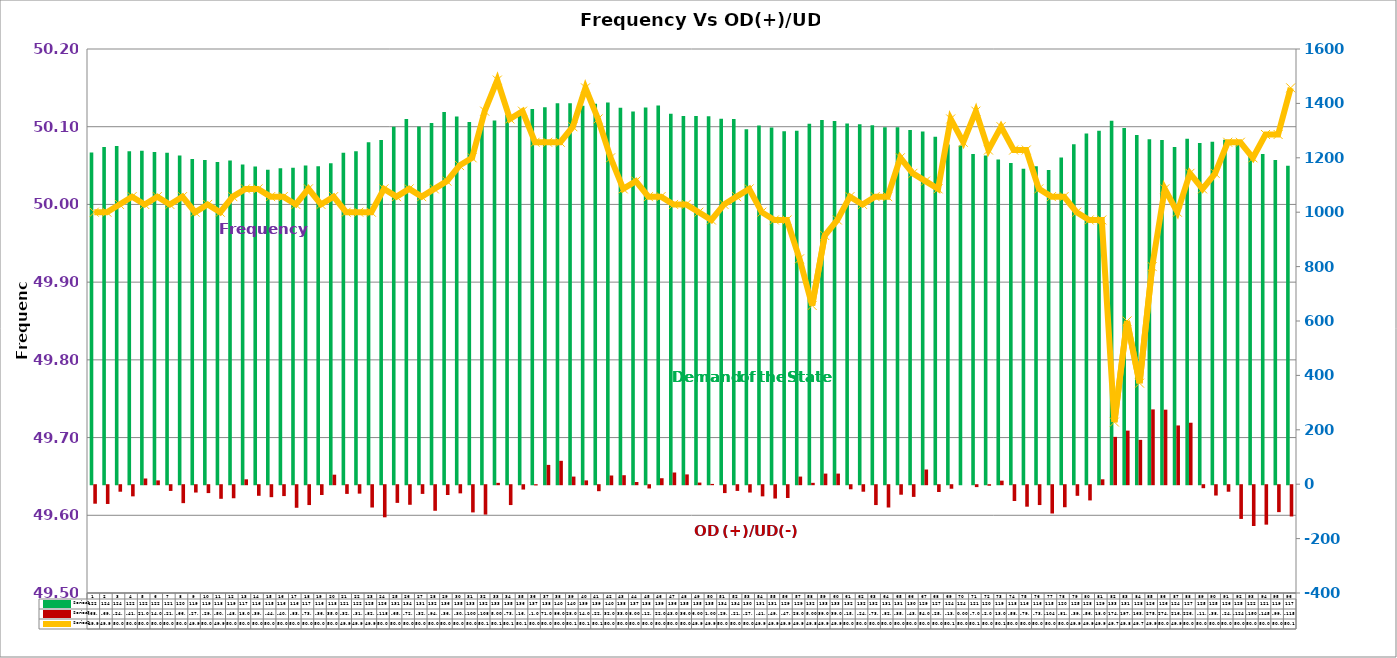
| Category | Series 2 | Series 4 |
|---|---|---|
| 0 | 1219.733 | -68 |
| 1 | 1240 | -69 |
| 2 | 1243 | -24 |
| 3 | 1224 | -41 |
| 4 | 1226 | 21 |
| 5 | 1221 | 14 |
| 6 | 1219 | -21 |
| 7 | 1208 | -66 |
| 8 | 1196 | -27 |
| 9 | 1192 | -29 |
| 10 | 1185 | -50 |
| 11 | 1190 | -48 |
| 12 | 1175 | 18 |
| 13 | 1167.667 | -39 |
| 14 | 1156 | -44 |
| 15 | 1162 | -40 |
| 16 | 1163 | -83 |
| 17 | 1172 | -73 |
| 18 | 1169 | -36 |
| 19 | 1180 | 35 |
| 20 | 1219 | -32 |
| 21 | 1224 | -31 |
| 22 | 1257 | -82 |
| 23 | 1265 | -118 |
| 24 | 1314 | -65 |
| 25 | 1343 | -72 |
| 26 | 1315 | -32 |
| 27 | 1328 | -94 |
| 28 | 1368 | -36 |
| 29 | 1352 | -30 |
| 30 | 1332 | -100 |
| 31 | 1329 | -108 |
| 32 | 1337 | 5 |
| 33 | 1357 | -73 |
| 34 | 1369 | -16 |
| 35 | 1379 | -1 |
| 36 | 1386 | 71 |
| 37 | 1401 | 86 |
| 38 | 1401 | 28 |
| 39 | 1391 | 14 |
| 40 | 1399 | -22 |
| 41 | 1403 | 32 |
| 42 | 1384 | 33 |
| 43 | 1370 | 8 |
| 44 | 1385 | -12 |
| 45 | 1392 | 22 |
| 46 | 1362 | 43 |
| 47 | 1354 | 36 |
| 48 | 1354 | 6 |
| 49 | 1353 | 1 |
| 50 | 1344 | -29 |
| 51 | 1343 | -21 |
| 52 | 1305 | -27 |
| 53 | 1319 | -41 |
| 54 | 1311 | -49 |
| 55 | 1298 | -47 |
| 56 | 1299 | 28 |
| 57 | 1325 | 5 |
| 58 | 1339 | 39 |
| 59 | 1335 | 39 |
| 60 | 1326 | -15 |
| 61 | 1323 | -24 |
| 62 | 1320 | -73 |
| 63 | 1312 | -82 |
| 64 | 1312 | -35 |
| 65 | 1302 | -43 |
| 66 | 1297 | 54 |
| 67 | 1277 | -25 |
| 68 | 1249 | -13 |
| 69 | 1245 | 0 |
| 70 | 1214 | -7 |
| 71 | 1208 | -2 |
| 72 | 1194 | 13 |
| 73 | 1181 | -58 |
| 74 | 1160 | -79 |
| 75 | 1169 | -73 |
| 76 | 1155 | -104 |
| 77 | 1201 | -81 |
| 78 | 1250 | -39 |
| 79 | 1289 | -56 |
| 80 | 1299 | 18 |
| 81 | 1336 | 174 |
| 82 | 1310 | 197 |
| 83 | 1284 | 163 |
| 84 | 1268 | 275 |
| 85 | 1265 | 274 |
| 86 | 1240 | 216 |
| 87 | 1270 | 226 |
| 88 | 1254 | -11 |
| 89 | 1259 | -38 |
| 90 | 1266 | -24 |
| 91 | 1250 | -124 |
| 92 | 1221 | -150 |
| 93 | 1214 | -145 |
| 94 | 1192 | -99 |
| 95 | 1171 | -115 |